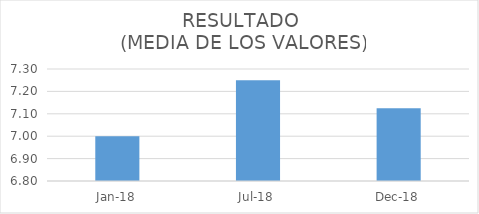
| Category | RESULTADO
 (MEDIA DE LOS VALORES) |
|---|---|
| 2018-01-01 | 7 |
| 2018-07-01 | 7.25 |
| 2018-12-01 | 7.125 |